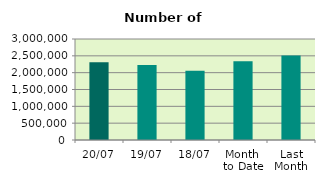
| Category | Series 0 |
|---|---|
| 20/07 | 2308148 |
| 19/07 | 2225626 |
| 18/07 | 2056428 |
| Month 
to Date | 2342145 |
| Last
Month | 2507488.545 |